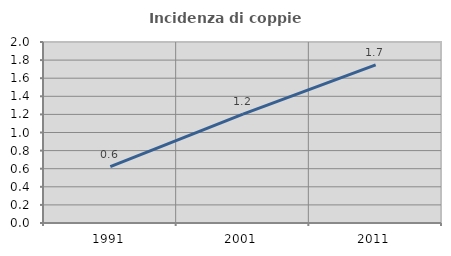
| Category | Incidenza di coppie miste |
|---|---|
| 1991.0 | 0.624 |
| 2001.0 | 1.203 |
| 2011.0 | 1.746 |